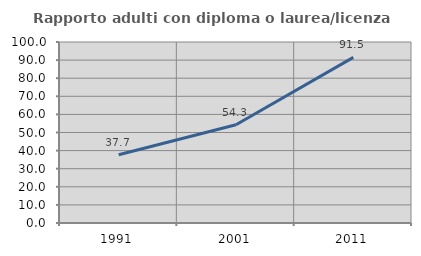
| Category | Rapporto adulti con diploma o laurea/licenza media  |
|---|---|
| 1991.0 | 37.74 |
| 2001.0 | 54.29 |
| 2011.0 | 91.499 |